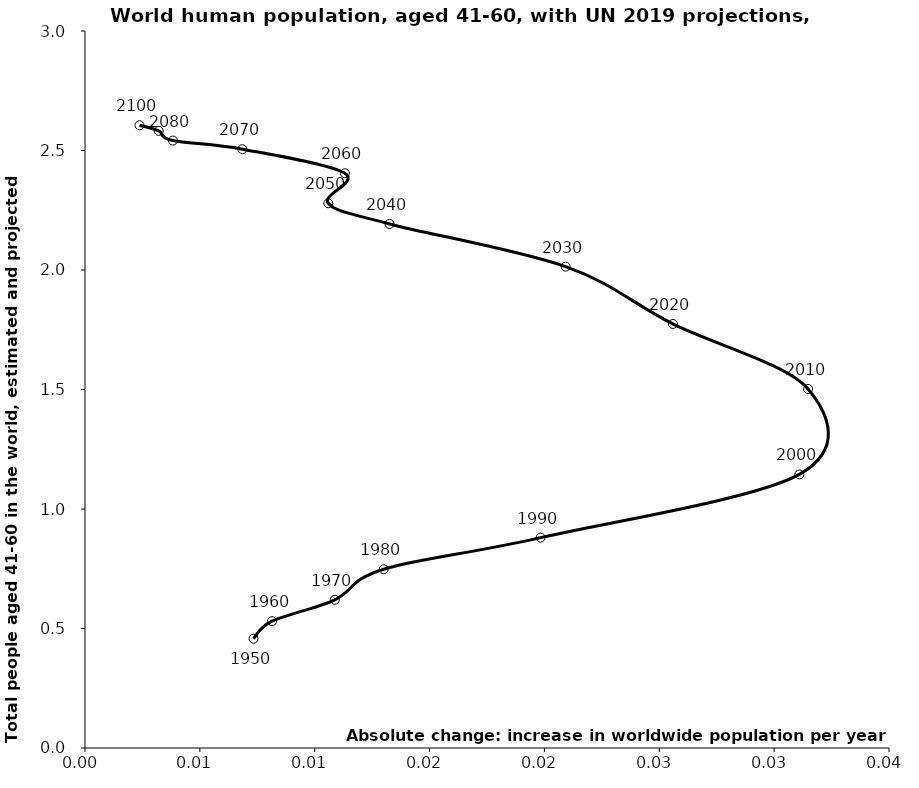
| Category | Series 0 |
|---|---|
| 0.007336536799999999 | 0.457 |
| 0.008144436700000004 | 0.531 |
| 0.01087443905 | 0.62 |
| 0.01300450799999998 | 0.748 |
| 0.019833269199999996 | 0.88 |
| 0.031097368700000027 | 1.145 |
| 0.03147643695 | 1.502 |
| 0.025592993650000007 | 1.774 |
| 0.020921476449999987 | 2.014 |
| 0.013255492399999968 | 2.193 |
| 0.010589061200000027 | 2.279 |
| 0.011315199550000021 | 2.405 |
| 0.006851098749999984 | 2.505 |
| 0.0038253350999999823 | 2.542 |
| 0.0032071806000000037 | 2.582 |
| 0.002371793000000011 | 2.606 |